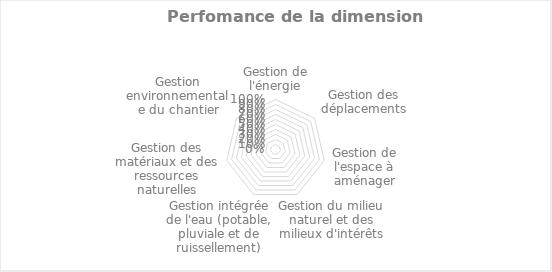
| Category | 0% |
|---|---|
| Gestion de l'énergie | 0 |
| Gestion des déplacements | 0 |
| Gestion de l'espace à aménager | 0 |
| Gestion du milieu naturel et des milieux d'intérêts | 0 |
| Gestion intégrée de l'eau (potable, pluviale et de ruissellement) | 0 |
| Gestion des matériaux et des ressources naturelles | 0 |
| Gestion environnementale du chantier | 0 |